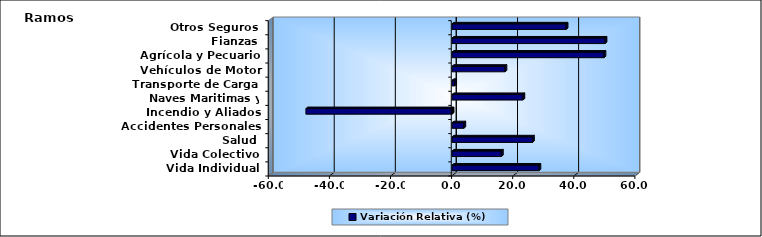
| Category | Variación Relativa (%) |
|---|---|
| Vida Individual | 28.421 |
| Vida Colectivo | 16.129 |
| Salud | 26.307 |
| Accidentes Personales | 3.838 |
| Incendio y Aliados | -47.833 |
| Naves Maritimas y Aéreas | 23.177 |
| Transporte de Carga | 0.851 |
| Vehículos de Motor | 17.308 |
| Agrícola y Pecuario | 49.718 |
| Fianzas | 50.064 |
| Otros Seguros | 37.32 |